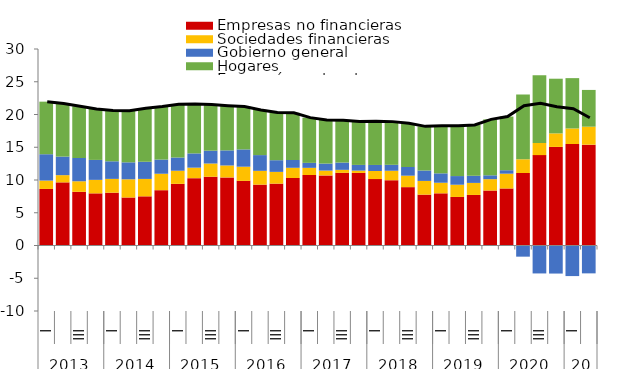
| Category | Empresas no financieras | Sociedades financieras | Gobierno general | Hogares |
|---|---|---|---|---|
| 0 | 8.633 | 1.281 | 4.021 | 8.026 |
| 1 | 9.639 | 1.102 | 2.834 | 8.088 |
| 2 | 8.194 | 1.612 | 3.551 | 7.899 |
| 3 | 7.962 | 2.059 | 3.046 | 7.77 |
| 4 | 8.063 | 2.107 | 2.684 | 7.756 |
| 5 | 7.331 | 2.777 | 2.588 | 7.868 |
| 6 | 7.507 | 2.657 | 2.621 | 8.166 |
| 7 | 8.443 | 2.511 | 2.166 | 8.096 |
| 8 | 9.412 | 2.003 | 2.018 | 8.13 |
| 9 | 10.285 | 1.601 | 2.176 | 7.561 |
| 10 | 10.497 | 2.02 | 1.96 | 7.047 |
| 11 | 10.397 | 1.821 | 2.305 | 6.827 |
| 12 | 9.869 | 2.163 | 2.637 | 6.551 |
| 13 | 9.293 | 2.106 | 2.403 | 6.9 |
| 14 | 9.447 | 1.792 | 1.783 | 7.282 |
| 15 | 10.307 | 1.558 | 1.188 | 7.209 |
| 16 | 10.766 | 1.091 | 0.759 | 6.906 |
| 17 | 10.702 | 0.736 | 1.069 | 6.661 |
| 18 | 11.096 | 0.455 | 1.112 | 6.447 |
| 19 | 11.076 | 0.36 | 0.868 | 6.614 |
| 20 | 10.139 | 1.239 | 0.92 | 6.69 |
| 21 | 9.966 | 1.446 | 0.906 | 6.594 |
| 22 | 8.91 | 1.75 | 1.321 | 6.669 |
| 23 | 7.767 | 2.093 | 1.588 | 6.741 |
| 24 | 7.966 | 1.616 | 1.434 | 7.276 |
| 25 | 7.411 | 1.868 | 1.321 | 7.668 |
| 26 | 7.719 | 1.837 | 1.089 | 7.754 |
| 27 | 8.393 | 1.733 | 0.59 | 8.537 |
| 28 | 8.708 | 2.258 | 0.528 | 8.193 |
| 29 | 11.072 | 2.09 | -1.704 | 9.883 |
| 30 | 13.8 | 1.855 | -4.266 | 10.32 |
| 31 | 15.05 | 2.068 | -4.285 | 8.346 |
| 32 | 15.499 | 2.369 | -4.669 | 7.684 |
| 33 | 15.394 | 2.748 | -4.254 | 5.61 |